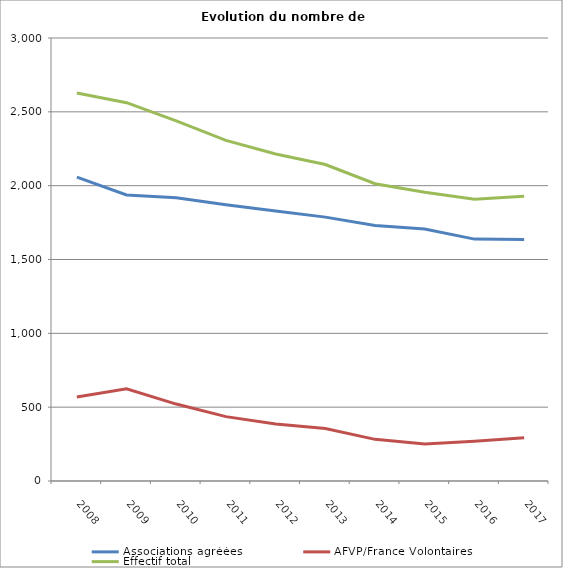
| Category | Associations agréées | AFVP/France Volontaires | Effectif total |
|---|---|---|---|
| 2008.0 | 2058 | 569 | 2627 |
| 2009.0 | 1937 | 625 | 2562 |
| 2010.0 | 1918 | 521 | 2439 |
| 2011.0 | 1871 | 436 | 2307 |
| 2012.0 | 1828 | 386 | 2214 |
| 2013.0 | 1787 | 356 | 2143 |
| 2014.0 | 1731 | 282 | 2013 |
| 2015.0 | 1706 | 250 | 1956 |
| 2016.0 | 1638 | 270 | 1908 |
| 2017.0 | 1636 | 293 | 1929 |